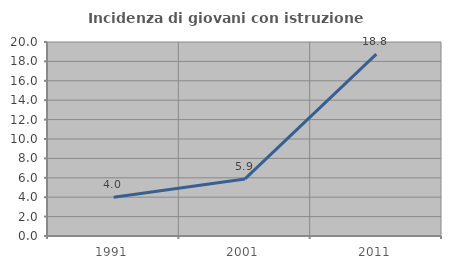
| Category | Incidenza di giovani con istruzione universitaria |
|---|---|
| 1991.0 | 4 |
| 2001.0 | 5.882 |
| 2011.0 | 18.75 |